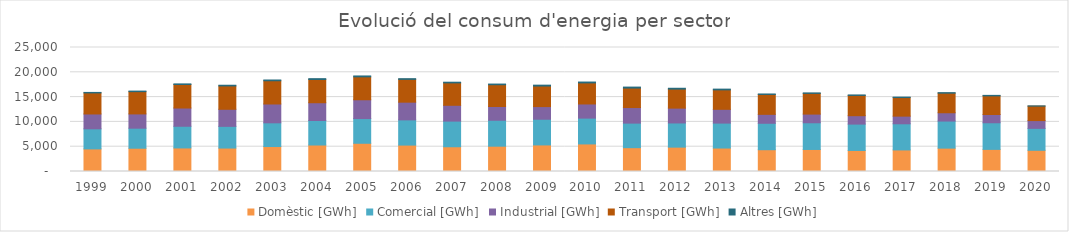
| Category | Domèstic [GWh] | Comercial [GWh] | Industrial [GWh] | Transport [GWh] | Altres [GWh] |
|---|---|---|---|---|---|
| 1999.0 | 4556.036 | 4049.601 | 2993.501 | 4244.246 | 99.757 |
| 2000.0 | 4692.315 | 4038.57 | 2878.736 | 4486.774 | 114.989 |
| 2001.0 | 4750.339 | 4368.862 | 3679.772 | 4739.312 | 124.831 |
| 2002.0 | 4727.675 | 4372.353 | 3442.84 | 4707.584 | 140.415 |
| 2003.0 | 5033.801 | 4779.74 | 3796.527 | 4683.433 | 155 |
| 2004.0 | 5340.752 | 4945.835 | 3576.704 | 4679.589 | 176.14 |
| 2005.0 | 5690.06 | 4981.522 | 3790.391 | 4620.078 | 181.25 |
| 2006.0 | 5325.526 | 5081.15 | 3570.532 | 4591.782 | 146.23 |
| 2007.0 | 4987.946 | 5170.455 | 3189.404 | 4517.58 | 137.56 |
| 2008.0 | 5102.061 | 5230.194 | 2774.59 | 4384.721 | 138.06 |
| 2009.0 | 5357.999 | 5179.352 | 2548.577 | 4142.221 | 179.771 |
| 2010.0 | 5557.847 | 5201.385 | 2856.292 | 4247.971 | 173.381 |
| 2011.0 | 4803.802 | 4949.985 | 3140.077 | 3927.507 | 197.258 |
| 2012.0 | 4912.908 | 4874.178 | 2989.518 | 3832.877 | 172.531 |
| 2013.0 | 4730.525 | 5026.401 | 2780.129 | 3918.035 | 154.092 |
| 2014.0 | 4393.404 | 5327.08 | 1803.583 | 4008.089 | 95.409 |
| 2015.0 | 4442.383 | 5379.924 | 1752.545 | 4169.555 | 97.451 |
| 2016.0 | 4242.862 | 5312.62 | 1694.759 | 4082.421 | 101.075 |
| 2017.0 | 4348.541 | 5270.542 | 1542.259 | 3744.945 | 89.02 |
| 2018.0 | 4711.418 | 5456.23 | 1675.289 | 3950.475 | 102.81 |
| 2019.0 | 4458.496 | 5367.396 | 1668.264 | 3752.165 | 100.621 |
| 2020.0 | 4276.784 | 4419.067 | 1571.041 | 2917.198 | 37.998 |